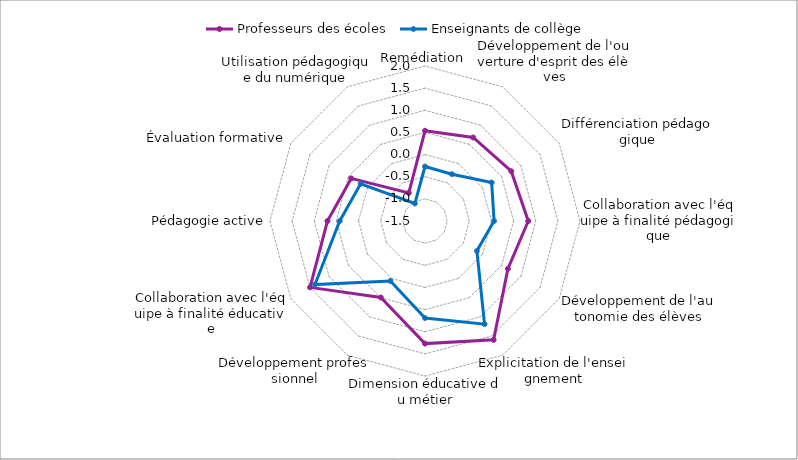
| Category | Professeurs des écoles | Enseignants de collège |
|---|---|---|
| Remédiation | 0.538 | -0.269 |
| Développement de l'ouverture d'esprit des élèves | 0.677 | -0.28 |
| Différenciation pédagogique | 0.749 | 0.238 |
| Collaboration avec l'équipe à finalité pédagogique | 0.832 | 0.06 |
| Développement de l'autonomie des élèves | 0.66 | -0.147 |
| Explicitation de l'enseignement | 1.599 | 1.189 |
| Dimension éducative du métier | 1.268 | 0.691 |
| Développement professionnel | 0.496 | 0.063 |
| Collaboration avec l'équipe à finalité éducative | 1.497 | 1.369 |
| Pédagogie active | 0.703 | 0.426 |
| Évaluation formative | 0.424 | 0.178 |
| Utilisation pédagogique du numérique | -0.767 | -1.043 |